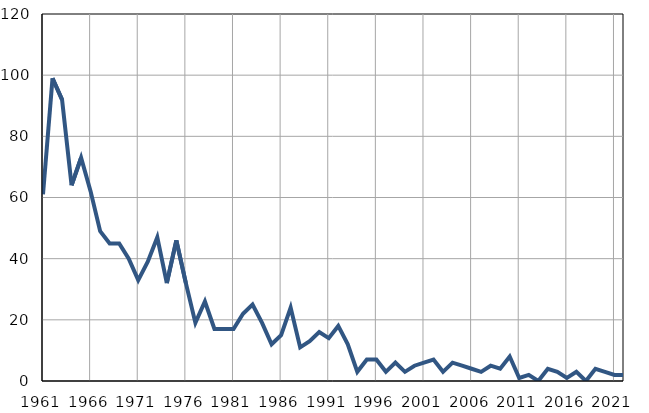
| Category | Infants
deaths |
|---|---|
| 1961.0 | 61 |
| 1962.0 | 99 |
| 1963.0 | 92 |
| 1964.0 | 64 |
| 1965.0 | 73 |
| 1966.0 | 62 |
| 1967.0 | 49 |
| 1968.0 | 45 |
| 1969.0 | 45 |
| 1970.0 | 40 |
| 1971.0 | 33 |
| 1972.0 | 39 |
| 1973.0 | 47 |
| 1974.0 | 32 |
| 1975.0 | 46 |
| 1976.0 | 32 |
| 1977.0 | 19 |
| 1978.0 | 26 |
| 1979.0 | 17 |
| 1980.0 | 17 |
| 1981.0 | 17 |
| 1982.0 | 22 |
| 1983.0 | 25 |
| 1984.0 | 19 |
| 1985.0 | 12 |
| 1986.0 | 15 |
| 1987.0 | 24 |
| 1988.0 | 11 |
| 1989.0 | 13 |
| 1990.0 | 16 |
| 1991.0 | 14 |
| 1992.0 | 18 |
| 1993.0 | 12 |
| 1994.0 | 3 |
| 1995.0 | 7 |
| 1996.0 | 7 |
| 1997.0 | 3 |
| 1998.0 | 6 |
| 1999.0 | 3 |
| 2000.0 | 5 |
| 2001.0 | 6 |
| 2002.0 | 7 |
| 2003.0 | 3 |
| 2004.0 | 6 |
| 2005.0 | 5 |
| 2006.0 | 4 |
| 2007.0 | 3 |
| 2008.0 | 5 |
| 2009.0 | 4 |
| 2010.0 | 8 |
| 2011.0 | 1 |
| 2012.0 | 2 |
| 2013.0 | 0 |
| 2014.0 | 4 |
| 2015.0 | 3 |
| 2016.0 | 1 |
| 2017.0 | 3 |
| 2018.0 | 0 |
| 2019.0 | 4 |
| 2020.0 | 3 |
| 2021.0 | 2 |
| 2022.0 | 2 |